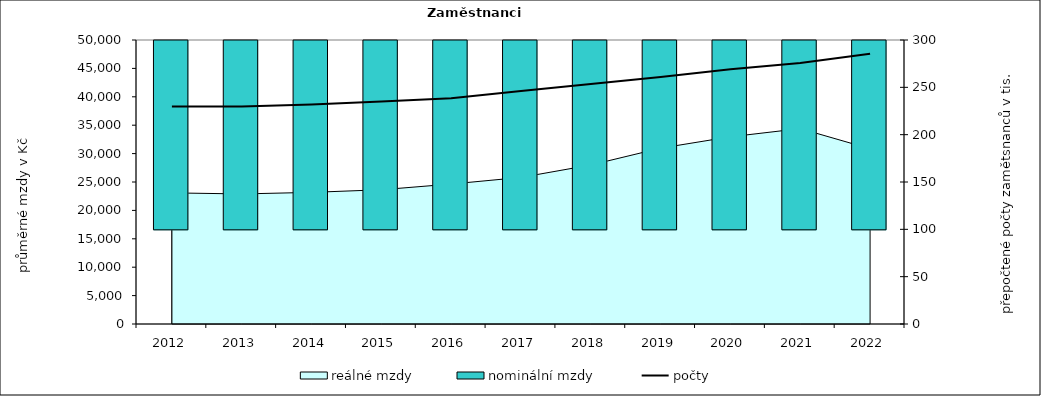
| Category | nominální mzdy  |
|---|---|
| 2012.0 | 22600.393 |
| 2013.0 | 22736.16 |
| 2014.0 | 23105.299 |
| 2015.0 | 23637.347 |
| 2016.0 | 24814.03 |
| 2017.0 | 26608.582 |
| 2018.0 | 29476 |
| 2019.0 | 33529.756 |
| 2020.0 | 36857.887 |
| 2021.0 | 39591.418 |
| 2022.0 | 40174.665 |